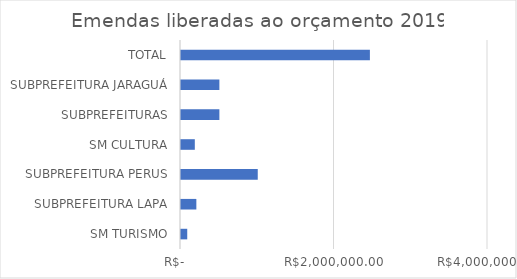
| Category | Series 0 |
|---|---|
| SM TURISMO | 81203.02 |
| SUBPREFEITURA LAPA | 200000 |
| SUBPREFEITURA PERUS | 1000000 |
| SM CULTURA | 180000 |
| SUBPREFEITURAS | 500000 |
| SUBPREFEITURA JARAGUÁ | 500000 |
| TOTAL | 2461203.02 |